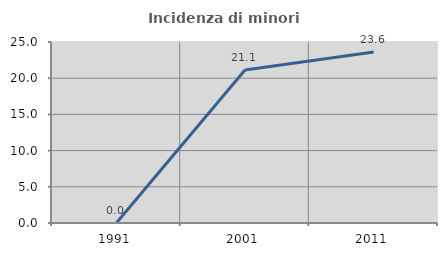
| Category | Incidenza di minori stranieri |
|---|---|
| 1991.0 | 0 |
| 2001.0 | 21.127 |
| 2011.0 | 23.626 |